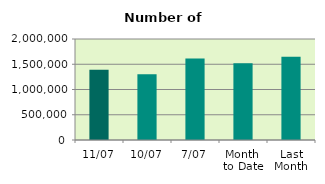
| Category | Series 0 |
|---|---|
| 11/07 | 1393070 |
| 10/07 | 1302988 |
| 7/07 | 1614784 |
| Month 
to Date | 1520761.143 |
| Last
Month | 1646651.818 |